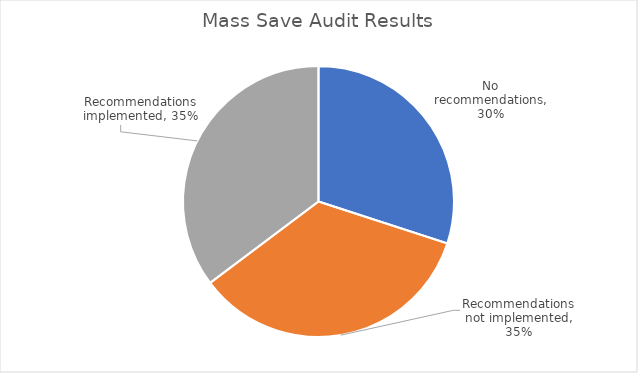
| Category | Audit results |
|---|---|
| No recommendations | 0.3 |
| Recommendations not implemented | 0.348 |
| Recommendations implemented | 0.352 |